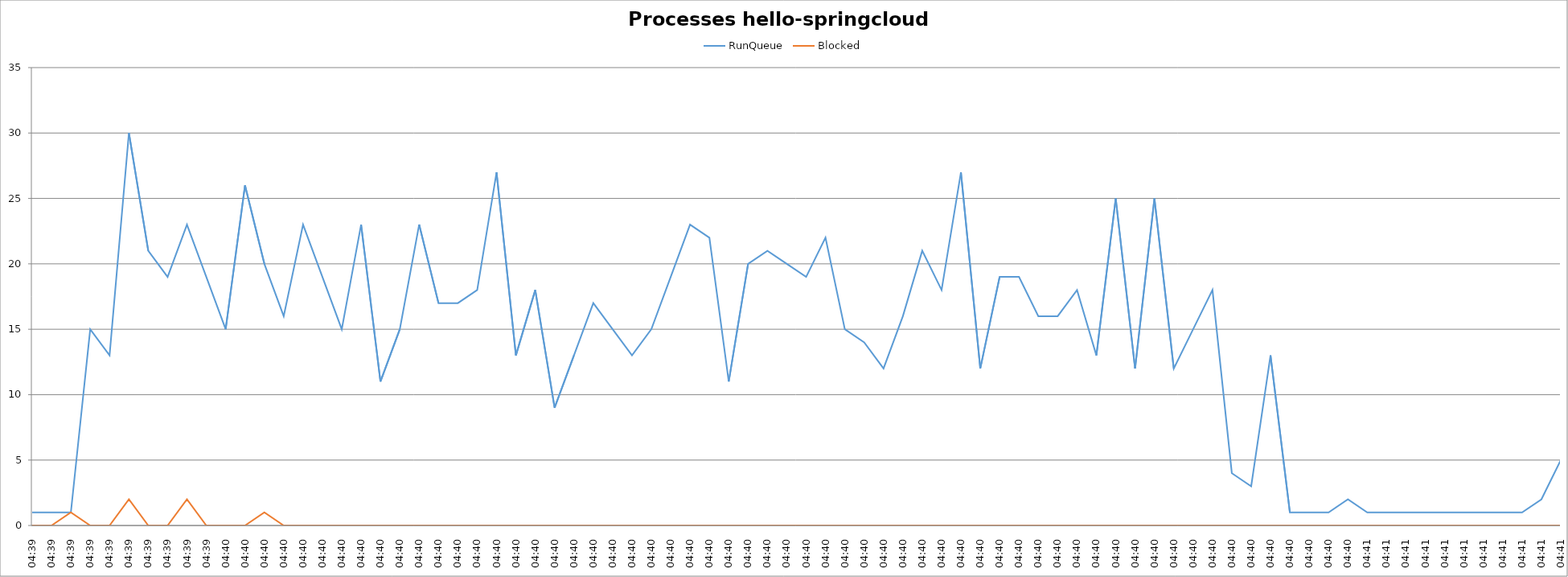
| Category | RunQueue | Blocked |
|---|---|---|
| 04:39 | 1 | 0 |
| 04:39 | 1 | 0 |
| 04:39 | 1 | 1 |
| 04:39 | 15 | 0 |
| 04:39 | 13 | 0 |
| 04:39 | 30 | 2 |
| 04:39 | 21 | 0 |
| 04:39 | 19 | 0 |
| 04:39 | 23 | 2 |
| 04:39 | 19 | 0 |
| 04:40 | 15 | 0 |
| 04:40 | 26 | 0 |
| 04:40 | 20 | 1 |
| 04:40 | 16 | 0 |
| 04:40 | 23 | 0 |
| 04:40 | 19 | 0 |
| 04:40 | 15 | 0 |
| 04:40 | 23 | 0 |
| 04:40 | 11 | 0 |
| 04:40 | 15 | 0 |
| 04:40 | 23 | 0 |
| 04:40 | 17 | 0 |
| 04:40 | 17 | 0 |
| 04:40 | 18 | 0 |
| 04:40 | 27 | 0 |
| 04:40 | 13 | 0 |
| 04:40 | 18 | 0 |
| 04:40 | 9 | 0 |
| 04:40 | 13 | 0 |
| 04:40 | 17 | 0 |
| 04:40 | 15 | 0 |
| 04:40 | 13 | 0 |
| 04:40 | 15 | 0 |
| 04:40 | 19 | 0 |
| 04:40 | 23 | 0 |
| 04:40 | 22 | 0 |
| 04:40 | 11 | 0 |
| 04:40 | 20 | 0 |
| 04:40 | 21 | 0 |
| 04:40 | 20 | 0 |
| 04:40 | 19 | 0 |
| 04:40 | 22 | 0 |
| 04:40 | 15 | 0 |
| 04:40 | 14 | 0 |
| 04:40 | 12 | 0 |
| 04:40 | 16 | 0 |
| 04:40 | 21 | 0 |
| 04:40 | 18 | 0 |
| 04:40 | 27 | 0 |
| 04:40 | 12 | 0 |
| 04:40 | 19 | 0 |
| 04:40 | 19 | 0 |
| 04:40 | 16 | 0 |
| 04:40 | 16 | 0 |
| 04:40 | 18 | 0 |
| 04:40 | 13 | 0 |
| 04:40 | 25 | 0 |
| 04:40 | 12 | 0 |
| 04:40 | 25 | 0 |
| 04:40 | 12 | 0 |
| 04:40 | 15 | 0 |
| 04:40 | 18 | 0 |
| 04:40 | 4 | 0 |
| 04:40 | 3 | 0 |
| 04:40 | 13 | 0 |
| 04:40 | 1 | 0 |
| 04:40 | 1 | 0 |
| 04:40 | 1 | 0 |
| 04:40 | 2 | 0 |
| 04:41 | 1 | 0 |
| 04:41 | 1 | 0 |
| 04:41 | 1 | 0 |
| 04:41 | 1 | 0 |
| 04:41 | 1 | 0 |
| 04:41 | 1 | 0 |
| 04:41 | 1 | 0 |
| 04:41 | 1 | 0 |
| 04:41 | 1 | 0 |
| 04:41 | 2 | 0 |
| 04:41 | 5 | 0 |